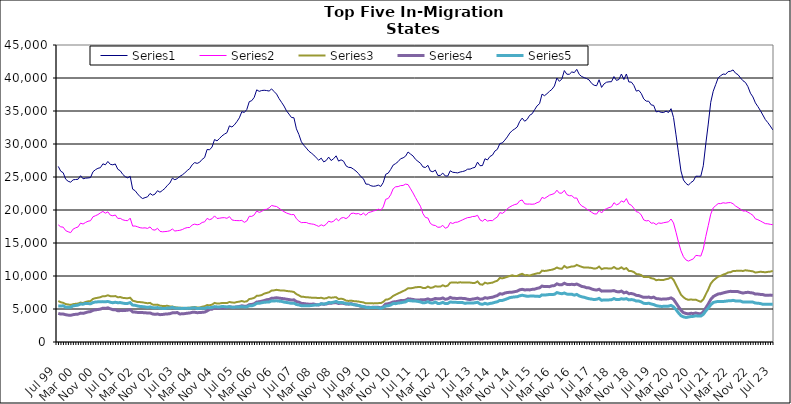
| Category | Series 0 | Series 1 | Series 2 | Series 3 | Series 4 |
|---|---|---|---|---|---|
| Jul 99 | 26605 | 17749 | 6209 | 4339 | 5471 |
| Aug 99 | 25882 | 17447 | 6022 | 4228 | 5444 |
| Sep 99 | 25644 | 17401 | 5941 | 4237 | 5488 |
| Oct 99 | 24669 | 16875 | 5751 | 4134 | 5279 |
| Nov 99 | 24353 | 16701 | 5680 | 4073 | 5260 |
| Dec 99 | 24218 | 16570 | 5619 | 4042 | 5269 |
| Jan 00 | 24574 | 17109 | 5736 | 4142 | 5485 |
| Feb 00 | 24620 | 17295 | 5789 | 4192 | 5530 |
| Mar 00 | 24655 | 17436 | 5826 | 4226 | 5590 |
| Apr 00 | 25195 | 18009 | 5980 | 4375 | 5748 |
| May 00 | 24730 | 17875 | 5897 | 4337 | 5729 |
| Jun 00 | 24825 | 18113 | 6070 | 4444 | 5853 |
| Jul 00 | 24857 | 18294 | 6163 | 4555 | 5824 |
| Aug 00 | 24913 | 18376 | 6199 | 4603 | 5788 |
| Sep 00 | 25792 | 18971 | 6529 | 4804 | 5976 |
| Oct 00 | 26106 | 19135 | 6643 | 4870 | 6058 |
| Nov 00 | 26315 | 19306 | 6705 | 4926 | 6085 |
| Dec 00 | 26415 | 19570 | 6793 | 4991 | 6096 |
| Jan 01 | 26995 | 19781 | 6942 | 5122 | 6119 |
| Feb 01 | 26851 | 19519 | 6948 | 5089 | 6090 |
| Mar 01 | 27352 | 19720 | 7080 | 5180 | 6143 |
| Apr 01 | 26918 | 19221 | 6943 | 5020 | 6020 |
| May 01 | 26848 | 19126 | 6924 | 4899 | 5950 |
| Jun 01 | 26974 | 19241 | 6959 | 4895 | 6019 |
| Jul 01 | 26172 | 18725 | 6778 | 4737 | 5951 |
| Aug 01 | 25943 | 18736 | 6810 | 4757 | 5973 |
| Sep 01 | 25399 | 18514 | 6688 | 4753 | 5895 |
| Oct 01 | 25050 | 18415 | 6650 | 4780 | 5833 |
| Nov 01 | 24873 | 18381 | 6631 | 4826 | 5850 |
| Dec 01 | 25099 | 18765 | 6708 | 4898 | 5969 |
| Jan 02 | 23158 | 17561 | 6261 | 4560 | 5595 |
| Feb 02 | 22926 | 17573 | 6162 | 4531 | 5560 |
| Mar 02 | 22433 | 17452 | 6052 | 4481 | 5458 |
| Apr 02 | 22012 | 17314 | 6046 | 4458 | 5380 |
| May 02 | 21733 | 17267 | 6007 | 4452 | 5358 |
| Jun 02 | 21876 | 17298 | 5933 | 4444 | 5315 |
| Jul 02 | 21997 | 17209 | 5873 | 4383 | 5243 |
| Aug 02 | 22507 | 17436 | 5929 | 4407 | 5315 |
| Sep 02 | 22244 | 17010 | 5672 | 4248 | 5192 |
| Oct 02 | 22406 | 16952 | 5625 | 4191 | 5167 |
| Nov 02 | 22922 | 17223 | 5663 | 4242 | 5221 |
| Dec 02 | 22693 | 16770 | 5499 | 4142 | 5120 |
| Jan 03 | 22964 | 16694 | 5463 | 4166 | 5089 |
| Feb 03 | 23276 | 16727 | 5461 | 4226 | 5077 |
| Mar 03 | 23736 | 16766 | 5486 | 4251 | 5145 |
| Apr 03 | 24079 | 16859 | 5389 | 4289 | 5145 |
| May 03 | 24821 | 17117 | 5378 | 4415 | 5254 |
| Jun 03 | 24592 | 16812 | 5273 | 4426 | 5135 |
| Jul 03 | 24754 | 16875 | 5226 | 4466 | 5124 |
| Aug 03 | 25092 | 16922 | 5181 | 4244 | 5100 |
| Sep 03 | 25316 | 17036 | 5181 | 4279 | 5086 |
| Oct 03 | 25622 | 17228 | 5139 | 4301 | 5110 |
| Nov 03 | 25984 | 17335 | 5175 | 4362 | 5091 |
| Dec 03 | 26269 | 17350 | 5189 | 4396 | 5113 |
| Jan 04 | 26852 | 17734 | 5255 | 4492 | 5152 |
| Feb 04 | 27184 | 17860 | 5301 | 4502 | 5183 |
| Mar 04 | 27062 | 17757 | 5227 | 4443 | 5056 |
| Apr 04 | 27238 | 17840 | 5227 | 4461 | 5104 |
| May 04 | 27671 | 18113 | 5345 | 4493 | 5095 |
| Jun 04 | 27949 | 18201 | 5416 | 4532 | 5103 |
| Jul 04 | 29172 | 18727 | 5597 | 4697 | 5231 |
| Aug 04 | 29122 | 18529 | 5561 | 4945 | 5197 |
| Sep 04 | 29542 | 18678 | 5656 | 4976 | 5237 |
| Oct 04 | 30674 | 19108 | 5922 | 5188 | 5363 |
| Nov 04 | 30472 | 18716 | 5823 | 5106 | 5321 |
| Dec 04 | 30831 | 18755 | 5838 | 5135 | 5312 |
| Jan 05 | 31224 | 18823 | 5906 | 5155 | 5374 |
| Feb 05 | 31495 | 18842 | 5898 | 5168 | 5357 |
| Mar 05 | 31714 | 18738 | 5894 | 5212 | 5313 |
| Apr 05 | 32750 | 18998 | 6060 | 5340 | 5350 |
| May 05 | 32575 | 18504 | 5989 | 5269 | 5276 |
| Jun 05 | 32898 | 18414 | 5954 | 5252 | 5271 |
| Jul 05 | 33384 | 18395 | 6062 | 5322 | 5322 |
| Aug 05 | 33964 | 18381 | 6113 | 5375 | 5316 |
| Sep 05 | 34897 | 18426 | 6206 | 5493 | 5362 |
| Oct 05 | 34780 | 18132 | 6100 | 5408 | 5308 |
| Nov 05 | 35223 | 18332 | 6162 | 5434 | 5314 |
| Dec 05 | 36415 | 19047 | 6508 | 5658 | 5487 |
| Jan 06 | 36567 | 19032 | 6576 | 5688 | 5480 |
| Feb 06 | 37074 | 19257 | 6692 | 5792 | 5616 |
| Mar 06 | 38207 | 19845 | 6993 | 6052 | 5850 |
| Apr 06 | 37976 | 19637 | 7024 | 6101 | 5864 |
| May 06 | 38099 | 19781 | 7114 | 6178 | 5943 |
| Jun 06 | 38141 | 20061 | 7331 | 6276 | 6018 |
| Jul 06 | 38097 | 20111 | 7431 | 6399 | 6046 |
| Aug 06 | 38021 | 20333 | 7542 | 6450 | 6064 |
| Sep 06 | 38349 | 20686 | 7798 | 6627 | 6232 |
| Oct 06 | 37947 | 20591 | 7825 | 6647 | 6216 |
| Nov 06 | 37565 | 20526 | 7907 | 6707 | 6244 |
| Dec 06 | 36884 | 20272 | 7840 | 6648 | 6192 |
| Jan 07 | 36321 | 19984 | 7789 | 6597 | 6151 |
| Feb 07 | 35752 | 19752 | 7799 | 6554 | 6048 |
| Mar 07 | 35025 | 19547 | 7737 | 6487 | 5989 |
| Apr 07 | 34534 | 19412 | 7685 | 6430 | 5937 |
| May 07 | 34022 | 19296 | 7654 | 6353 | 5858 |
| Jun 07 | 33974 | 19318 | 7577 | 6390 | 5886 |
| Jul 07 | 32298 | 18677 | 7250 | 6117 | 5682 |
| Aug 07 | 31436 | 18322 | 7070 | 6034 | 5617 |
| Sep 07 | 30331 | 18087 | 6853 | 5847 | 5500 |
| Oct 07 | 29813 | 18108 | 6839 | 5821 | 5489 |
| Nov 07 | 29384 | 18105 | 6777 | 5769 | 5481 |
| Dec 07 | 28923 | 17949 | 6760 | 5733 | 5499 |
| Jan 08 | 28627 | 17890 | 6721 | 5732 | 5521 |
| Feb 08 | 28328 | 17834 | 6719 | 5749 | 5579 |
| Mar 08 | 27911 | 17680 | 6690 | 5650 | 5614 |
| Apr 08 | 27543 | 17512 | 6656 | 5612 | 5635 |
| May 08 | 27856 | 17754 | 6705 | 5774 | 5798 |
| Jun 08 | 27287 | 17589 | 6593 | 5717 | 5745 |
| Jul 08 | 27495 | 17834 | 6623 | 5761 | 5807 |
| Aug 08 | 28018 | 18309 | 6789 | 5867 | 5982 |
| Sep-08 | 27491 | 18164 | 6708 | 5864 | 5954 |
| Oct 08 | 27771 | 18291 | 6755 | 5942 | 6032 |
| Nov 08 | 28206 | 18706 | 6787 | 5970 | 6150 |
| Dec 08 | 27408 | 18353 | 6505 | 5832 | 5975 |
| Jan 09 | 27601 | 18778 | 6569 | 5890 | 5995 |
| Feb 09 | 27394 | 18863 | 6483 | 5845 | 5936 |
| Mar 09 | 26690 | 18694 | 6273 | 5751 | 5806 |
| Apr 09 | 26461 | 18943 | 6222 | 5735 | 5777 |
| May 09 | 26435 | 19470 | 6272 | 5819 | 5767 |
| Jun 09 | 26187 | 19522 | 6199 | 5700 | 5649 |
| Jul 09 | 25906 | 19408 | 6171 | 5603 | 5617 |
| Aug 09 | 25525 | 19469 | 6128 | 5533 | 5540 |
| Sep 09 | 25050 | 19249 | 6059 | 5405 | 5437 |
| Oct 09 | 24741 | 19529 | 6004 | 5349 | 5369 |
| Nov 09 | 23928 | 19187 | 5854 | 5271 | 5248 |
| Dec 09 | 23899 | 19607 | 5886 | 5261 | 5195 |
| Jan 10 | 23676 | 19703 | 5881 | 5232 | 5234 |
| Feb 10 | 23592 | 19845 | 5850 | 5272 | 5236 |
| Mar 10 | 23634 | 19946 | 5864 | 5278 | 5219 |
| Apr 10 | 23774 | 20134 | 5889 | 5257 | 5201 |
| May 10 | 23567 | 19966 | 5897 | 5172 | 5105 |
| Jun 10 | 24166 | 20464 | 6087 | 5356 | 5237 |
| Jul 10 | 25410 | 21627 | 6417 | 5742 | 5452 |
| Aug 10 | 25586 | 21744 | 6465 | 5797 | 5491 |
| Sep 10 | 26150 | 22314 | 6667 | 5907 | 5609 |
| Oct 10 | 26807 | 23219 | 6986 | 6070 | 5831 |
| Nov 10 | 27033 | 23520 | 7179 | 6100 | 5810 |
| Dec 10 | 27332 | 23551 | 7361 | 6182 | 5898 |
| Jan 11 | 27769 | 23697 | 7525 | 6276 | 5938 |
| Feb 11 | 27898 | 23718 | 7708 | 6267 | 6016 |
| Mar 11 | 28155 | 23921 | 7890 | 6330 | 6081 |
| Apr 11 | 28790 | 23847 | 8146 | 6544 | 6305 |
| May 11 | 28471 | 23215 | 8131 | 6502 | 6248 |
| Jun 11 | 28191 | 22580 | 8199 | 6445 | 6217 |
| Jul 11 | 27678 | 21867 | 8291 | 6368 | 6202 |
| Aug 11 | 27372 | 21203 | 8321 | 6356 | 6146 |
| Sep 11 | 27082 | 20570 | 8341 | 6387 | 6075 |
| Oct 11 | 26528 | 19442 | 8191 | 6402 | 5932 |
| Nov 11 | 26440 | 18872 | 8176 | 6426 | 5968 |
| Dec 11 | 26770 | 18784 | 8401 | 6533 | 6106 |
| Jan 12 | 25901 | 17963 | 8202 | 6390 | 5933 |
| Feb 12 | 25796 | 17718 | 8266 | 6456 | 5900 |
| Mar 12 | 26042 | 17647 | 8456 | 6600 | 6054 |
| Apr 12 | 25239 | 17386 | 8388 | 6534 | 5838 |
| May 12 | 25238 | 17407 | 8401 | 6558 | 5854 |
| Jun 12 | 25593 | 17673 | 8594 | 6669 | 6009 |
| Jul 12 | 25155 | 17237 | 8432 | 6474 | 5817 |
| Aug 12 | 25146 | 17391 | 8536 | 6539 | 5842 |
| Sep 12 | 25942 | 18102 | 8989 | 6759 | 6061 |
| Oct 12 | 25718 | 17953 | 9012 | 6618 | 6027 |
| Nov 12 | 25677 | 18134 | 9032 | 6611 | 6009 |
| Dec 12 | 25619 | 18166 | 8981 | 6601 | 5999 |
| Jan 13 | 25757 | 18344 | 9051 | 6627 | 5989 |
| Feb-13 | 25830 | 18512 | 9001 | 6606 | 5968 |
| Mar-13 | 25940 | 18689 | 9021 | 6577 | 5853 |
| Apr 13 | 26187 | 18844 | 9013 | 6478 | 5925 |
| May 13 | 26192 | 18884 | 9003 | 6431 | 5924 |
| Jun-13 | 26362 | 19013 | 8948 | 6508 | 5896 |
| Jul 13 | 26467 | 19037 | 8958 | 6559 | 5948 |
| Aug 13 | 27253 | 19198 | 9174 | 6655 | 6020 |
| Sep 13 | 26711 | 18501 | 8747 | 6489 | 5775 |
| Oct 13 | 26733 | 18301 | 8681 | 6511 | 5711 |
| Nov 13 | 27767 | 18620 | 8989 | 6709 | 5860 |
| Dec 13 | 27583 | 18320 | 8863 | 6637 | 5740 |
| Jan 14 | 28107 | 18409 | 8939 | 6735 | 5843 |
| Feb-14 | 28313 | 18383 | 8989 | 6779 | 5893 |
| Mar 14 | 28934 | 18696 | 9160 | 6918 | 6015 |
| Apr 14 | 29192 | 18946 | 9291 | 7036 | 6099 |
| May 14 | 30069 | 19603 | 9701 | 7314 | 6304 |
| Jun 14 | 30163 | 19487 | 9641 | 7252 | 6293 |
| Jul-14 | 30587 | 19754 | 9752 | 7415 | 6427 |
| Aug-14 | 31074 | 20201 | 9882 | 7499 | 6557 |
| Sep 14 | 31656 | 20459 | 9997 | 7536 | 6719 |
| Oct 14 | 32037 | 20663 | 10109 | 7555 | 6786 |
| Nov 14 | 32278 | 20825 | 9992 | 7628 | 6831 |
| Dec 14 | 32578 | 20918 | 10006 | 7705 | 6860 |
| Jan 15 | 33414 | 21396 | 10213 | 7906 | 7000 |
| Feb 15 | 33922 | 21518 | 10337 | 7982 | 7083 |
| Mar 15 | 33447 | 20942 | 10122 | 7891 | 7006 |
| Apr-15 | 33731 | 20893 | 10138 | 7906 | 6931 |
| May 15 | 34343 | 20902 | 10053 | 7895 | 6952 |
| Jun-15 | 34572 | 20870 | 10192 | 7973 | 6966 |
| Jul 15 | 35185 | 20916 | 10303 | 8000 | 6949 |
| Aug 15 | 35780 | 21115 | 10399 | 8126 | 6938 |
| Sep 15 | 36109 | 21246 | 10428 | 8207 | 6896 |
| Oct 15 | 37555 | 21908 | 10813 | 8477 | 7140 |
| Nov 15 | 37319 | 21750 | 10763 | 8390 | 7112 |
| Dec 15 | 37624 | 21990 | 10807 | 8395 | 7149 |
| Jan 16 | 37978 | 22248 | 10892 | 8388 | 7201 |
| Feb 16 | 38285 | 22369 | 10951 | 8508 | 7192 |
| Mar 16 | 38792 | 22506 | 11075 | 8547 | 7226 |
| Apr 16 | 39994 | 22999 | 11286 | 8815 | 7487 |
| May 16 | 39488 | 22548 | 11132 | 8673 | 7382 |
| Jun 16 | 39864 | 22556 | 11100 | 8682 | 7315 |
| Jul 16 | 41123 | 22989 | 11516 | 8903 | 7420 |
| Aug 16 | 40573 | 22333 | 11251 | 8731 | 7261 |
| Sep 16 | 40560 | 22162 | 11340 | 8692 | 7216 |
| Oct 16 | 40923 | 22172 | 11456 | 8742 | 7233 |
| Nov 16 | 40817 | 21818 | 11459 | 8685 | 7101 |
| Dec 16 | 41311 | 21815 | 11681 | 8783 | 7203 |
| Jan 17 | 40543 | 21029 | 11524 | 8609 | 6982 |
| Feb 17 | 40218 | 20613 | 11385 | 8416 | 6852 |
| Mar 17 | 40052 | 20425 | 11276 | 8354 | 6775 |
| Apr 17 | 39913 | 20147 | 11297 | 8218 | 6653 |
| May 17 | 39695 | 19910 | 11265 | 8196 | 6552 |
| Jun 17 | 39177 | 19650 | 11225 | 8034 | 6500 |
| Jul 17 | 38901 | 19419 | 11115 | 7923 | 6429 |
| Aug 17 | 38827 | 19389 | 11168 | 7867 | 6479 |
| Sep 17 | 39736 | 19936 | 11426 | 7991 | 6609 |
| Oct 17 | 38576 | 19547 | 11041 | 7708 | 6315 |
| Nov 17 | 39108 | 20013 | 11158 | 7746 | 6381 |
| Dec 17 | 39359 | 20202 | 11185 | 7743 | 6366 |
| Jan 18 | 39420 | 20362 | 11118 | 7736 | 6380 |
| Feb 18 | 39440 | 20476 | 11128 | 7741 | 6407 |
| Mar 18 | 40218 | 21106 | 11362 | 7789 | 6578 |
| Apr 18 | 39637 | 20788 | 11111 | 7642 | 6423 |
| May 18 | 39777 | 20933 | 11097 | 7591 | 6430 |
| Jun 18 | 40602 | 21381 | 11317 | 7721 | 6554 |
| Jul 18 | 39767 | 21189 | 11038 | 7445 | 6489 |
| Aug 18 | 40608 | 21729 | 11200 | 7560 | 6569 |
| Sep 18 | 39395 | 20916 | 10772 | 7318 | 6383 |
| Oct 18 | 39383 | 20724 | 10740 | 7344 | 6429 |
| Nov 18 | 38891 | 20265 | 10605 | 7255 | 6365 |
| Dec 18 | 38013 | 19741 | 10292 | 7069 | 6205 |
| Jan 19 | 38130 | 19643 | 10261 | 7032 | 6203 |
| Feb 19 | 37658 | 19237 | 10132 | 6892 | 6073 |
| Mar 19 | 36831 | 18492 | 9848 | 6766 | 5863 |
| Apr 19 | 36492 | 18349 | 9839 | 6763 | 5827 |
| May 19 | 36481 | 18407 | 9867 | 6809 | 5873 |
| Jun 19 | 35925 | 17998 | 9661 | 6698 | 5761 |
| Jul 19 | 35843 | 18049 | 9598 | 6800 | 5673 |
| Aug 19 | 34870 | 17785 | 9361 | 6577 | 5512 |
| Sep 19 | 34945 | 18038 | 9428 | 6547 | 5437 |
| Oct 19 | 34802 | 17977 | 9385 | 6483 | 5390 |
| Nov 19 | 34775 | 18072 | 9403 | 6511 | 5401 |
| Dec 19 | 34976 | 18140 | 9518 | 6521 | 5419 |
| Jan 20 | 34774 | 18209 | 9594 | 6561 | 5434 |
| Feb 20 | 35352 | 18632 | 9804 | 6682 | 5543 |
| Mar 20 | 34013 | 18041 | 9411 | 6464 | 5330 |
| Apr 20 | 31385 | 16629 | 8666 | 5922 | 4906 |
| May 20 | 28657 | 15123 | 7927 | 5355 | 4419 |
| Jun 20 | 25915 | 13817 | 7164 | 4815 | 3992 |
| Jul 20 | 24545 | 12926 | 6776 | 4457 | 3810 |
| Aug 20 | 24048 | 12443 | 6521 | 4326 | 3720 |
| Sep 20 | 23756 | 12258 | 6386 | 4266 | 3784 |
| Oct 20 | 24166 | 12429 | 6452 | 4347 | 3861 |
| Nov 20 | 24404 | 12597 | 6386 | 4324 | 3883 |
| Dec 20 | 25120 | 13122 | 6420 | 4394 | 3974 |
| Jan 21 | 25111 | 13080 | 6236 | 4304 | 3924 |
| Feb 21 | 25114 | 13015 | 6094 | 4260 | 3930 |
| Mar 21 | 26701 | 14096 | 6455 | 4567 | 4185 |
| Apr 21 | 29998 | 15978 | 7222 | 5164 | 4697 |
| May 21 | 33020 | 17641 | 7969 | 5748 | 5148 |
| Jun 21 | 36320 | 19369 | 8840 | 6450 | 5628 |
| Jul 21 | 37989 | 20320 | 9306 | 6877 | 5984 |
| Aug 21 | 39007 | 20657 | 9615 | 7094 | 6084 |
| Sep 21 | 40023 | 20974 | 9914 | 7277 | 6151 |
| Oct 21 | 40348 | 20966 | 10003 | 7327 | 6140 |
| Nov 21 | 40599 | 21096 | 10203 | 7437 | 6136 |
| Dec 21 | 40548 | 21032 | 10328 | 7532 | 6183 |
| Jan 22 | 40967 | 21106 | 10535 | 7618 | 6237 |
| Feb 22 | 41019 | 21125 | 10579 | 7673 | 6236 |
| Mar 22 | 41220 | 20949 | 10751 | 7660 | 6310 |
| Apr 22 | 40730 | 20602 | 10772 | 7661 | 6221 |
| May 22 | 40504 | 20370 | 10792 | 7636 | 6210 |
| Jun 22 | 40013 | 20127 | 10802 | 7504 | 6199 |
| Jul 22 | 39582 | 19846 | 10761 | 7419 | 6050 |
| Aug 22 | 39321 | 19865 | 10868 | 7487 | 6071 |
| Sep 22 | 38685 | 19666 | 10811 | 7536 | 6074 |
| Oct 22 | 37700 | 19450 | 10764 | 7469 | 6042 |
| Nov 22 | 37133 | 19198 | 10701 | 7425 | 6042 |
| Dec 22 | 36232 | 18659 | 10527 | 7261 | 5898 |
| Jan 23 | 35674 | 18528 | 10578 | 7263 | 5879 |
| Feb 23 | 35072 | 18344 | 10642 | 7211 | 5827 |
| Mar 23 | 34396 | 18133 | 10609 | 7183 | 5713 |
| Apr 23 | 33708 | 17931 | 10559 | 7074 | 5706 |
| May 23 | 33245 | 17904 | 10624 | 7091 | 5712 |
| Jun 23 | 32727 | 17831 | 10663 | 7105 | 5726 |
| Jul 23 | 32148 | 17773 | 10760 | 7058 | 5719 |